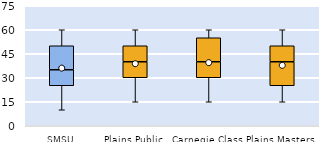
| Category | 25th | 50th | 75th |
|---|---|---|---|
| SMSU | 25 | 10 | 15 |
| Plains Public | 30 | 10 | 10 |
| Carnegie Class | 30 | 10 | 15 |
| Plains Masters | 25 | 15 | 10 |